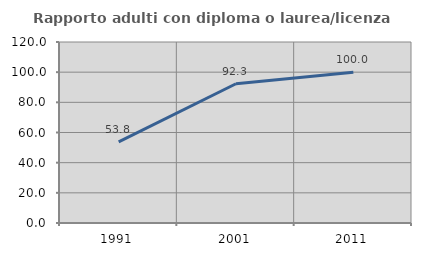
| Category | Rapporto adulti con diploma o laurea/licenza media  |
|---|---|
| 1991.0 | 53.846 |
| 2001.0 | 92.308 |
| 2011.0 | 100 |